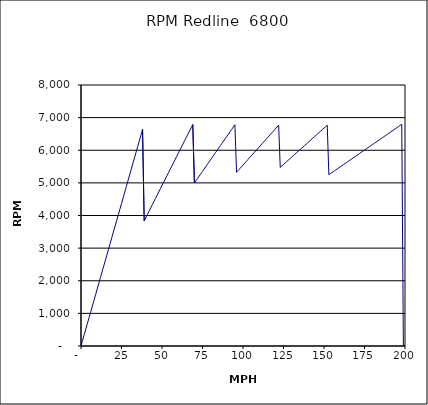
| Category | RPM Redline  6800 |
|---|---|
| 0.0 | 0 |
| 1.0 | 174.709 |
| 2.0 | 349.418 |
| 3.0 | 524.127 |
| 4.0 | 698.836 |
| 5.0 | 873.545 |
| 6.0 | 1048.254 |
| 7.0 | 1222.963 |
| 8.0 | 1397.672 |
| 9.0 | 1572.381 |
| 10.0 | 1747.09 |
| 11.0 | 1921.799 |
| 12.0 | 2096.508 |
| 13.0 | 2271.217 |
| 14.0 | 2445.926 |
| 15.0 | 2620.635 |
| 16.0 | 2795.344 |
| 17.0 | 2970.053 |
| 18.0 | 3144.762 |
| 19.0 | 3319.471 |
| 20.0 | 3494.18 |
| 21.0 | 3668.889 |
| 22.0 | 3843.598 |
| 23.0 | 4018.307 |
| 24.0 | 4193.016 |
| 25.0 | 4367.725 |
| 26.0 | 4542.434 |
| 27.0 | 4717.143 |
| 28.0 | 4891.852 |
| 29.0 | 5066.561 |
| 30.0 | 5241.27 |
| 31.0 | 5415.979 |
| 32.0 | 5590.688 |
| 33.0 | 5765.397 |
| 34.0 | 5940.106 |
| 35.0 | 6114.815 |
| 36.0 | 6289.524 |
| 37.0 | 6464.233 |
| 38.0 | 6638.942 |
| 39.0 | 3836.734 |
| 40.0 | 3935.112 |
| 41.0 | 4033.49 |
| 42.0 | 4131.868 |
| 43.0 | 4230.245 |
| 44.0 | 4328.623 |
| 45.0 | 4427.001 |
| 46.0 | 4525.379 |
| 47.0 | 4623.757 |
| 48.0 | 4722.134 |
| 49.0 | 4820.512 |
| 50.0 | 4918.89 |
| 51.0 | 5017.268 |
| 52.0 | 5115.646 |
| 53.0 | 5214.023 |
| 54.0 | 5312.401 |
| 55.0 | 5410.779 |
| 56.0 | 5509.157 |
| 57.0 | 5607.535 |
| 58.0 | 5705.912 |
| 59.0 | 5804.29 |
| 60.0 | 5902.668 |
| 61.0 | 6001.046 |
| 62.0 | 6099.424 |
| 63.0 | 6197.801 |
| 64.0 | 6296.179 |
| 65.0 | 6394.557 |
| 66.0 | 6492.935 |
| 67.0 | 6591.313 |
| 68.0 | 6689.69 |
| 69.0 | 6788.068 |
| 70.0 | 4996.677 |
| 71.0 | 5068.058 |
| 72.0 | 5139.439 |
| 73.0 | 5210.82 |
| 74.0 | 5282.202 |
| 75.0 | 5353.583 |
| 76.0 | 5424.964 |
| 77.0 | 5496.345 |
| 78.0 | 5567.726 |
| 79.0 | 5639.107 |
| 80.0 | 5710.488 |
| 81.0 | 5781.869 |
| 82.0 | 5853.25 |
| 83.0 | 5924.631 |
| 84.0 | 5996.013 |
| 85.0 | 6067.394 |
| 86.0 | 6138.775 |
| 87.0 | 6210.156 |
| 88.0 | 6281.537 |
| 89.0 | 6352.918 |
| 90.0 | 6424.299 |
| 91.0 | 6495.68 |
| 92.0 | 6567.061 |
| 93.0 | 6638.442 |
| 94.0 | 6709.824 |
| 95.0 | 6781.205 |
| 96.0 | 5324.464 |
| 97.0 | 5379.928 |
| 98.0 | 5435.391 |
| 99.0 | 5490.854 |
| 100.0 | 5546.317 |
| 101.0 | 5601.78 |
| 102.0 | 5657.243 |
| 103.0 | 5712.707 |
| 104.0 | 5768.17 |
| 105.0 | 5823.633 |
| 106.0 | 5879.096 |
| 107.0 | 5934.559 |
| 108.0 | 5990.022 |
| 109.0 | 6045.486 |
| 110.0 | 6100.949 |
| 111.0 | 6156.412 |
| 112.0 | 6211.875 |
| 113.0 | 6267.338 |
| 114.0 | 6322.802 |
| 115.0 | 6378.265 |
| 116.0 | 6433.728 |
| 117.0 | 6489.191 |
| 118.0 | 6544.654 |
| 119.0 | 6600.117 |
| 120.0 | 6655.581 |
| 121.0 | 6711.044 |
| 122.0 | 6766.507 |
| 123.0 | 5476.014 |
| 124.0 | 5520.534 |
| 125.0 | 5565.055 |
| 126.0 | 5609.575 |
| 127.0 | 5654.096 |
| 128.0 | 5698.616 |
| 129.0 | 5743.136 |
| 130.0 | 5787.657 |
| 131.0 | 5832.177 |
| 132.0 | 5876.698 |
| 133.0 | 5921.218 |
| 134.0 | 5965.739 |
| 135.0 | 6010.259 |
| 136.0 | 6054.779 |
| 137.0 | 6099.3 |
| 138.0 | 6143.82 |
| 139.0 | 6188.341 |
| 140.0 | 6232.861 |
| 141.0 | 6277.382 |
| 142.0 | 6321.902 |
| 143.0 | 6366.423 |
| 144.0 | 6410.943 |
| 145.0 | 6455.463 |
| 146.0 | 6499.984 |
| 147.0 | 6544.504 |
| 148.0 | 6589.025 |
| 149.0 | 6633.545 |
| 150.0 | 6678.066 |
| 151.0 | 6722.586 |
| 152.0 | 6767.106 |
| 153.0 | 5250.629 |
| 154.0 | 5284.947 |
| 155.0 | 5319.265 |
| 156.0 | 5353.583 |
| 157.0 | 5387.9 |
| 158.0 | 5422.218 |
| 159.0 | 5456.536 |
| 160.0 | 5490.854 |
| 161.0 | 5525.172 |
| 162.0 | 5559.49 |
| 163.0 | 5593.807 |
| 164.0 | 5628.125 |
| 165.0 | 5662.443 |
| 166.0 | 5696.761 |
| 167.0 | 5731.079 |
| 168.0 | 5765.397 |
| 169.0 | 5799.714 |
| 170.0 | 5834.032 |
| 171.0 | 5868.35 |
| 172.0 | 5902.668 |
| 173.0 | 5936.986 |
| 174.0 | 5971.304 |
| 175.0 | 6005.622 |
| 176.0 | 6039.939 |
| 177.0 | 6074.257 |
| 178.0 | 6108.575 |
| 179.0 | 6142.893 |
| 180.0 | 6177.211 |
| 181.0 | 6211.529 |
| 182.0 | 6245.846 |
| 183.0 | 6280.164 |
| 184.0 | 6314.482 |
| 185.0 | 6348.8 |
| 186.0 | 6383.118 |
| 187.0 | 6417.436 |
| 188.0 | 6451.753 |
| 189.0 | 6486.071 |
| 190.0 | 6520.389 |
| 191.0 | 6554.707 |
| 192.0 | 6589.025 |
| 193.0 | 6623.343 |
| 194.0 | 6657.66 |
| 195.0 | 6691.978 |
| 196.0 | 6726.296 |
| 197.0 | 6760.614 |
| 198.0 | 6794.932 |
| 199.0 | 0 |
| 200.0 | 0 |